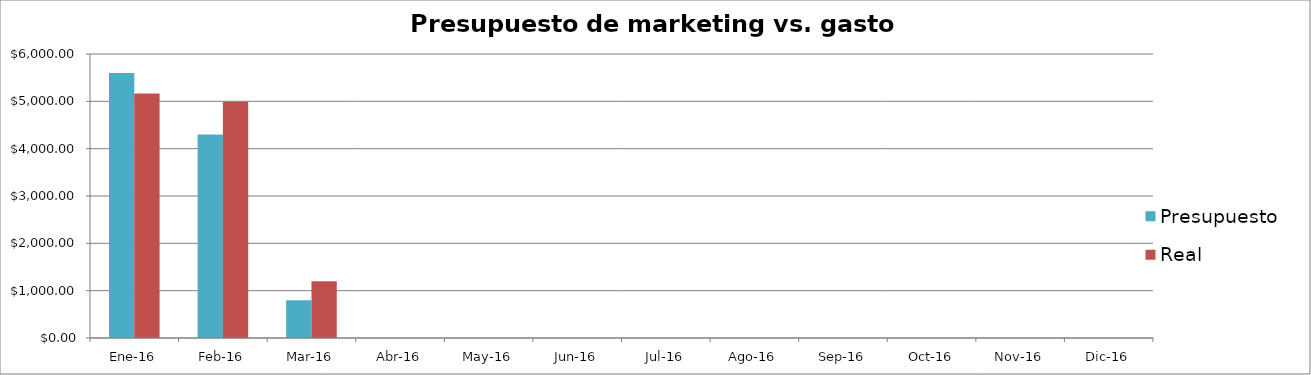
| Category | Presupuesto | Real |
|---|---|---|
| Ene-16 | 5600 | 5166 |
| Feb-16 | 4300 | 4989 |
| Mar-16 | 800 | 1200 |
| Abr-16 | 0 | 0 |
| May-16 | 0 | 0 |
| Jun-16 | 0 | 0 |
| Jul-16 | 0 | 0 |
| Ago-16 | 0 | 0 |
| Sep-16 | 0 | 0 |
| Oct-16 | 0 | 0 |
| Nov-16 | 0 | 0 |
| Dic-16 | 0 | 0 |